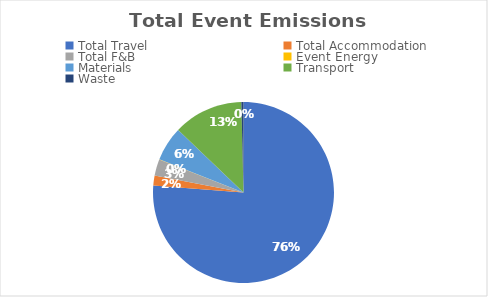
| Category | Series 0 |
|---|---|
| Total Travel | 78.49 |
| Total Accommodation | 1.83 |
| Total F&B | 3.02 |
| Event Energy | 0.06 |
| Materials | 6.34 |
| Transport | 12.83 |
| Waste | 0.39 |